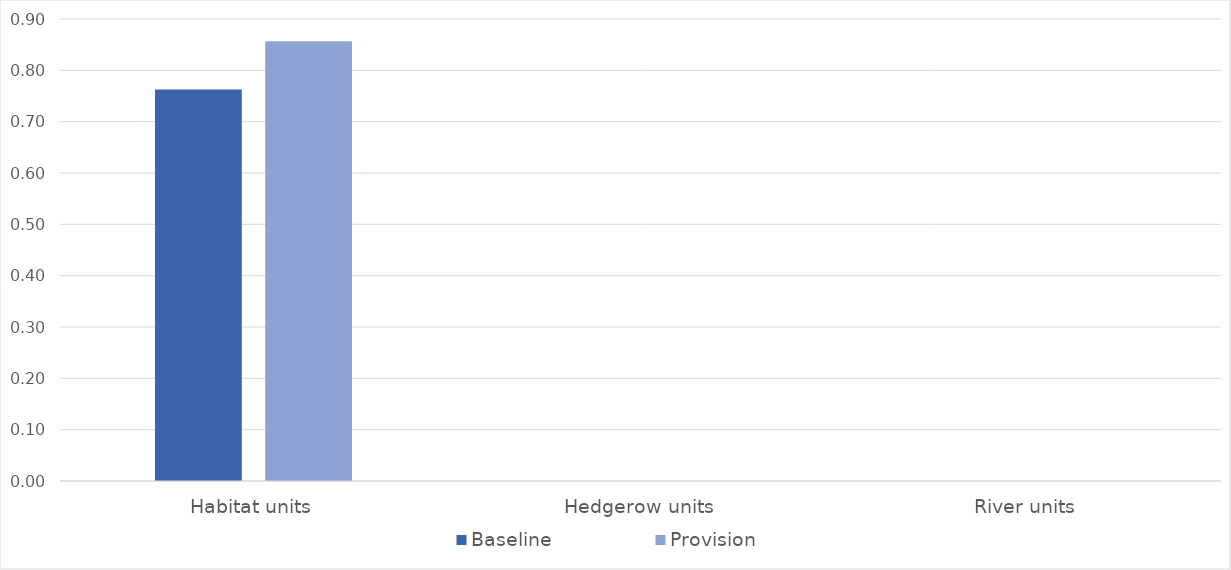
| Category | Baseline | Provision |
|---|---|---|
| Habitat units | 0.763 | 0.857 |
| Hedgerow units | 0 | 0 |
| River units | 0 | 0 |